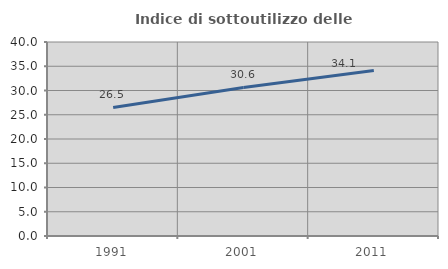
| Category | Indice di sottoutilizzo delle abitazioni  |
|---|---|
| 1991.0 | 26.502 |
| 2001.0 | 30.632 |
| 2011.0 | 34.14 |